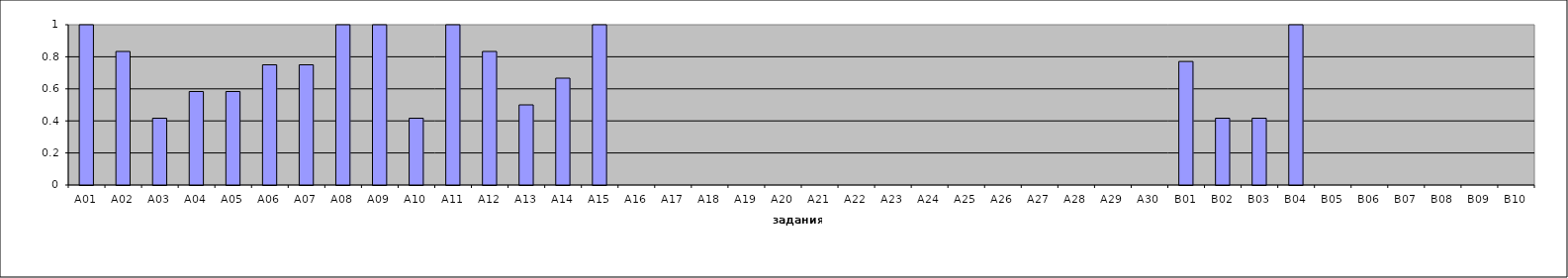
| Category | Общие результаты по тесту |
|---|---|
| A01 | 1 |
| A02 | 0.833 |
| A03 | 0.417 |
| A04 | 0.583 |
| A05 | 0.583 |
| A06 | 0.75 |
| A07 | 0.75 |
| A08 | 1 |
| A09 | 1 |
| A10 | 0.417 |
| A11 | 1 |
| A12 | 0.833 |
| A13 | 0.5 |
| A14 | 0.667 |
| A15 | 1 |
| A16 | 0 |
| A17 | 0 |
| A18 | 0 |
| A19 | 0 |
| A20 | 0 |
| A21 | 0 |
| A22 | 0 |
| A23 | 0 |
| A24 | 0 |
| A25 | 0 |
| A26 | 0 |
| A27 | 0 |
| A28 | 0 |
| A29 | 0 |
| A30 | 0 |
| B01 | 0.771 |
| B02 | 0.417 |
| B03 | 0.417 |
| B04 | 1 |
| B05 | 0 |
| B06 | 0 |
| B07 | 0 |
| B08 | 0 |
| B09 | 0 |
| B10 | 0 |